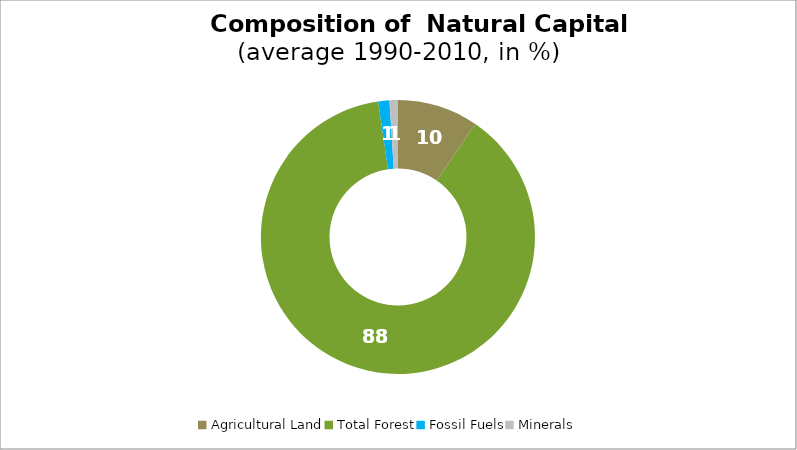
| Category | Series 0 |
|---|---|
| Agricultural Land | 9.547 |
| Total Forest | 88.131 |
| Fossil Fuels | 1.328 |
| Minerals | 0.993 |